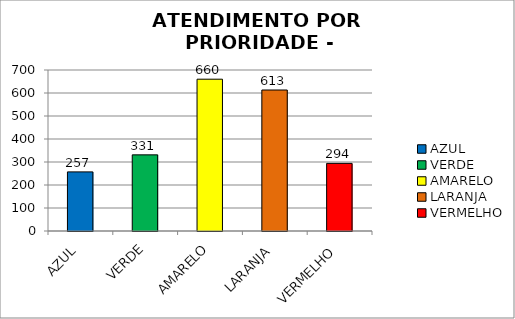
| Category | Total Regional: |
|---|---|
| AZUL | 257 |
| VERDE | 331 |
| AMARELO | 660 |
| LARANJA | 613 |
| VERMELHO | 294 |